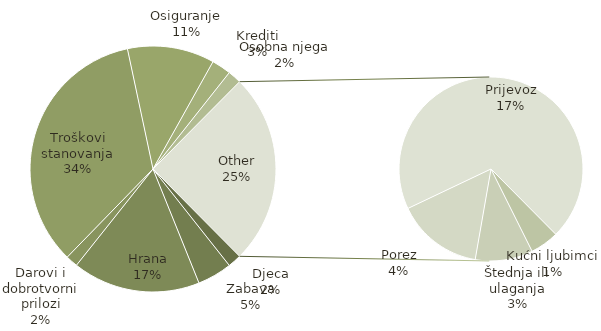
| Category | Zbroj |
|---|---|
| Djeca | 140 |
| Zabava | 358 |
| Hrana | 1320 |
| Darovi i dobrotvorni prilozi | 125 |
| Troškovi stanovanja | 2702 |
| Osiguranje | 900 |
| Krediti | 200 |
| Osobna njega | 140 |
| Kućni ljubimci | 100 |
| Štednja ili ulaganja | 200 |
| Porez | 300 |
| Prijevoz | 1375 |